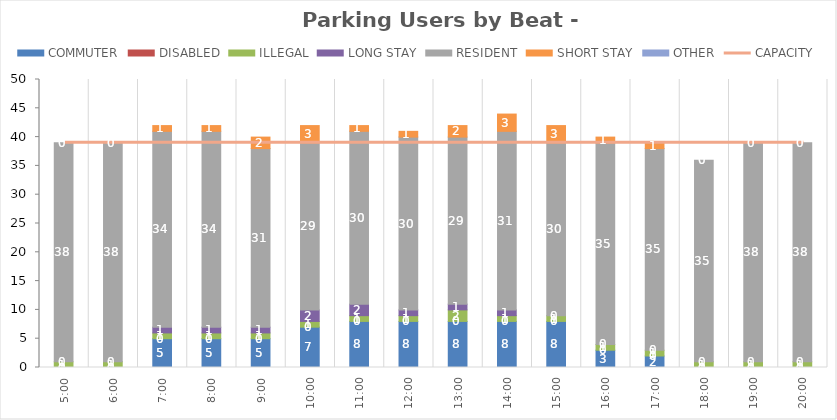
| Category | COMMUTER | DISABLED | ILLEGAL | LONG STAY | RESIDENT | SHORT STAY | OTHER |
|---|---|---|---|---|---|---|---|
| 0.20833333333333334 | 0 | 0 | 1 | 0 | 38 | 0 | 0 |
| 0.25 | 0 | 0 | 1 | 0 | 38 | 0 | 0 |
| 0.2916666666666667 | 5 | 0 | 1 | 1 | 34 | 1 | 0 |
| 0.3333333333333333 | 5 | 0 | 1 | 1 | 34 | 1 | 0 |
| 0.375 | 5 | 0 | 1 | 1 | 31 | 2 | 0 |
| 0.4166666666666667 | 7 | 0 | 1 | 2 | 29 | 3 | 0 |
| 0.4583333333333333 | 8 | 0 | 1 | 2 | 30 | 1 | 0 |
| 0.5 | 8 | 0 | 1 | 1 | 30 | 1 | 0 |
| 0.5416666666666666 | 8 | 0 | 2 | 1 | 29 | 2 | 0 |
| 0.5833333333333334 | 8 | 0 | 1 | 1 | 31 | 3 | 0 |
| 0.625 | 8 | 0 | 1 | 0 | 30 | 3 | 0 |
| 0.6666666666666666 | 3 | 0 | 1 | 0 | 35 | 1 | 0 |
| 0.7083333333333334 | 2 | 0 | 1 | 0 | 35 | 1 | 0 |
| 0.75 | 0 | 0 | 1 | 0 | 35 | 0 | 0 |
| 0.7916666666666666 | 0 | 0 | 1 | 0 | 38 | 0 | 0 |
| 0.8333333333333334 | 0 | 0 | 1 | 0 | 38 | 0 | 0 |